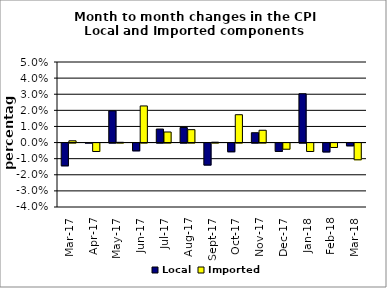
| Category | Local | Imported |
|---|---|---|
| 2017-03-01 | -0.014 | 0.001 |
| 2017-04-01 | 0 | -0.005 |
| 2017-05-01 | 0.02 | 0 |
| 2017-06-01 | -0.005 | 0.023 |
| 2017-07-01 | 0.008 | 0.007 |
| 2017-08-01 | 0.009 | 0.008 |
| 2017-09-01 | -0.014 | 0 |
| 2017-10-01 | -0.005 | 0.017 |
| 2017-11-01 | 0.006 | 0.008 |
| 2017-12-01 | -0.005 | -0.004 |
| 2018-01-01 | 0.03 | -0.005 |
| 2018-02-01 | -0.006 | -0.003 |
| 2018-03-01 | -0.002 | -0.01 |